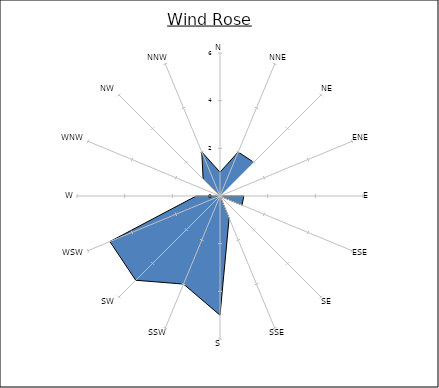
| Category | Series 0 |
|---|---|
| N | 1 |
| NNE | 2 |
| NE | 2 |
| ENE | 0 |
| E | 1 |
| ESE | 1 |
| SE | 0 |
| SSE | 1 |
| S | 5 |
| SSW | 4 |
| SW | 5 |
| WSW | 5 |
| W | 1 |
| WNW | 0 |
| NW | 1 |
| NNW | 2 |